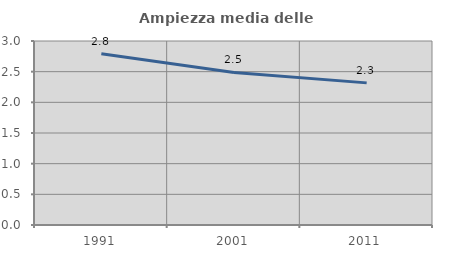
| Category | Ampiezza media delle famiglie |
|---|---|
| 1991.0 | 2.791 |
| 2001.0 | 2.488 |
| 2011.0 | 2.317 |